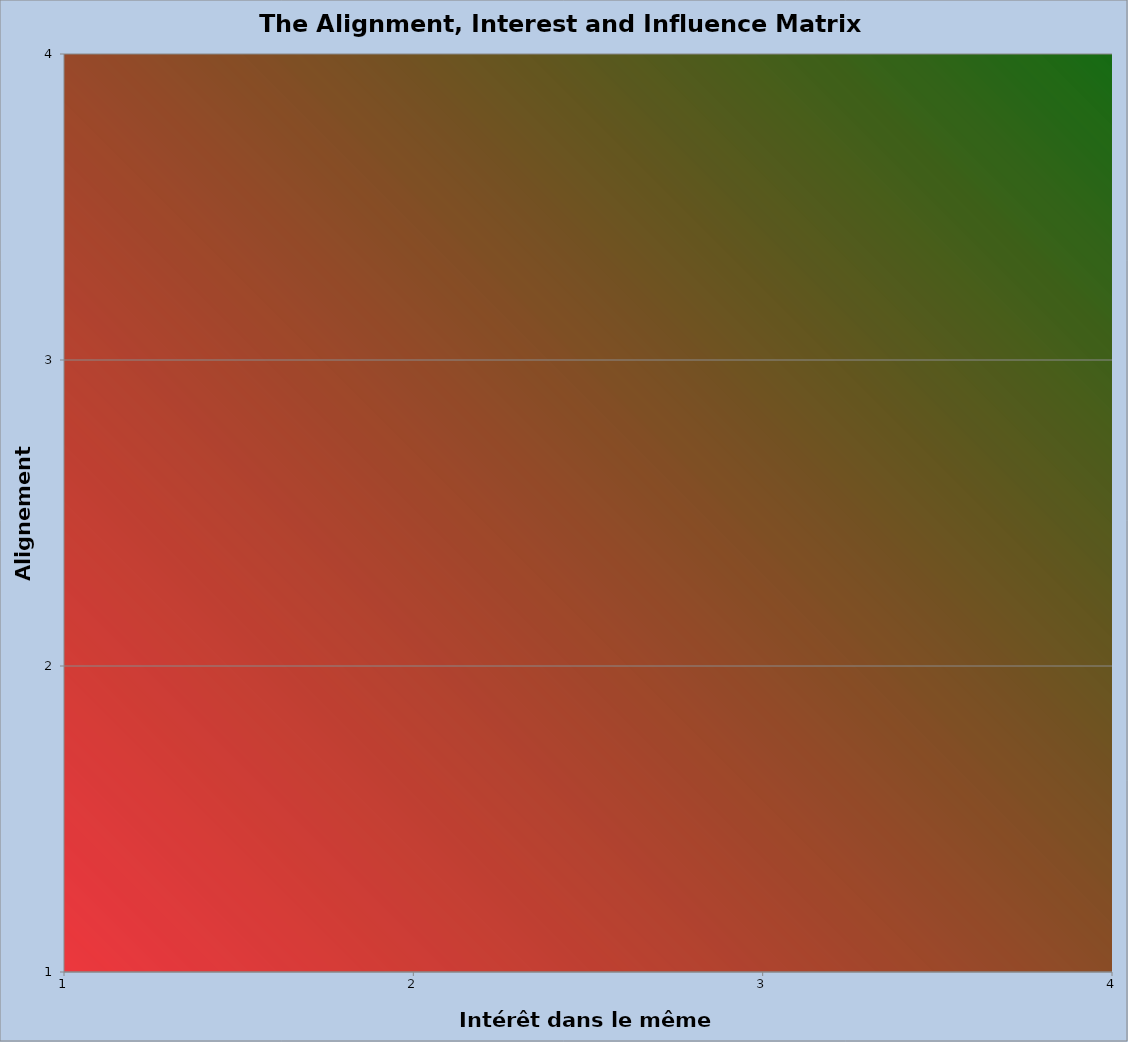
| Category | AIIM_value |
|---|---|
| 0 | 0 |
| 1 | 0 |
| 2 | 0 |
| 3 | 0 |
| 4 | 0 |
| 5 | 0 |
| 6 | 0 |
| 7 | 0 |
| 8 | 0 |
| 9 | 0 |
| 10 | 0 |
| 11 | 0 |
| 12 | 0 |
| 13 | 0 |
| 14 | 0 |
| 15 | 0 |
| 16 | 0 |
| 17 | 0 |
| 18 | 0 |
| 19 | 0 |
| 20 | 0 |
| 21 | 0 |
| 22 | 0 |
| 23 | 0 |
| 24 | 0 |
| 25 | 0 |
| 26 | 0 |
| 27 | 0 |
| 28 | 0 |
| 29 | 0 |